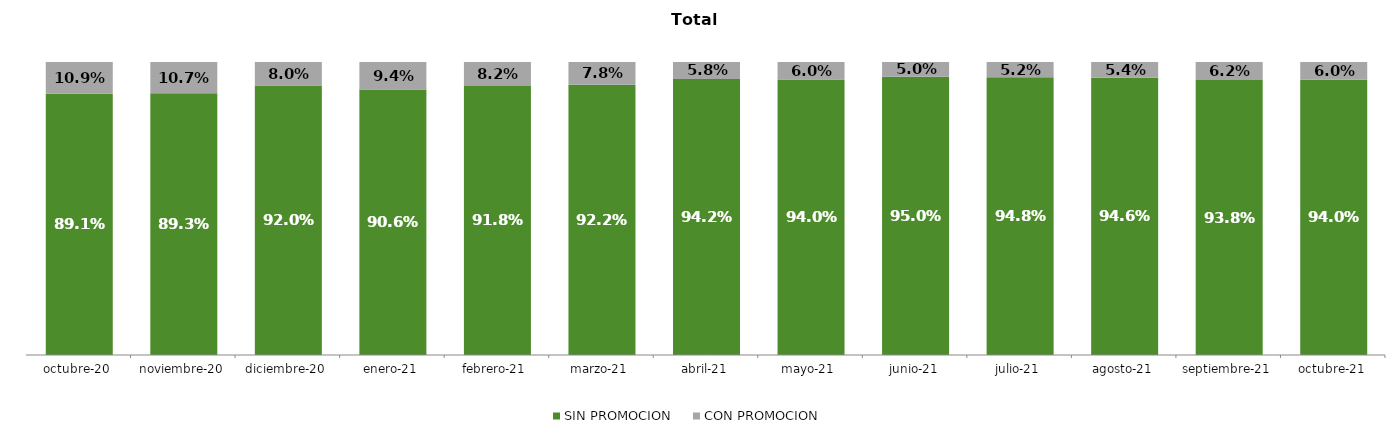
| Category | SIN PROMOCION   | CON PROMOCION   |
|---|---|---|
| 2020-10-01 | 0.891 | 0.109 |
| 2020-11-01 | 0.893 | 0.107 |
| 2020-12-01 | 0.92 | 0.08 |
| 2021-01-01 | 0.906 | 0.094 |
| 2021-02-01 | 0.918 | 0.082 |
| 2021-03-01 | 0.922 | 0.078 |
| 2021-04-01 | 0.942 | 0.058 |
| 2021-05-01 | 0.94 | 0.06 |
| 2021-06-01 | 0.95 | 0.05 |
| 2021-07-01 | 0.948 | 0.052 |
| 2021-08-01 | 0.946 | 0.054 |
| 2021-09-01 | 0.938 | 0.062 |
| 2021-10-01 | 0.94 | 0.06 |